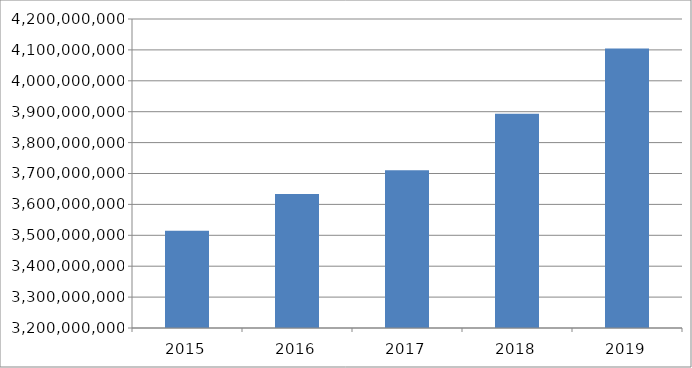
| Category | Ukupni izdaci socijalne zaštite  |
|---|---|
| 2015 | 3514423100.568 |
| 2016 | 3633713167.316 |
| 2017 | 3710279013.49 |
| 2018 | 3893455488.46 |
| 2019 | 4104612965.83 |